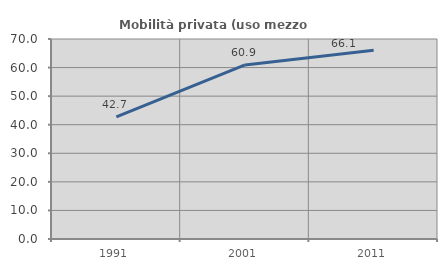
| Category | Mobilità privata (uso mezzo privato) |
|---|---|
| 1991.0 | 42.723 |
| 2001.0 | 60.939 |
| 2011.0 | 66.062 |